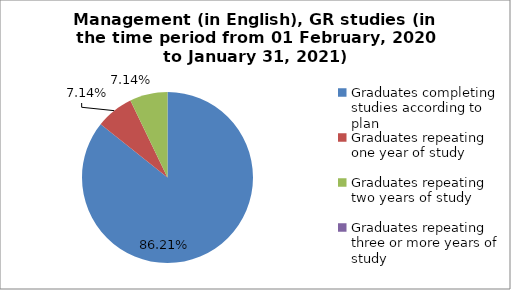
| Category | Series 0 |
|---|---|
| Graduates completing studies according to plan | 85.714 |
| Graduates repeating one year of study | 7.143 |
| Graduates repeating two years of study | 7.143 |
| Graduates repeating three or more years of study | 0 |